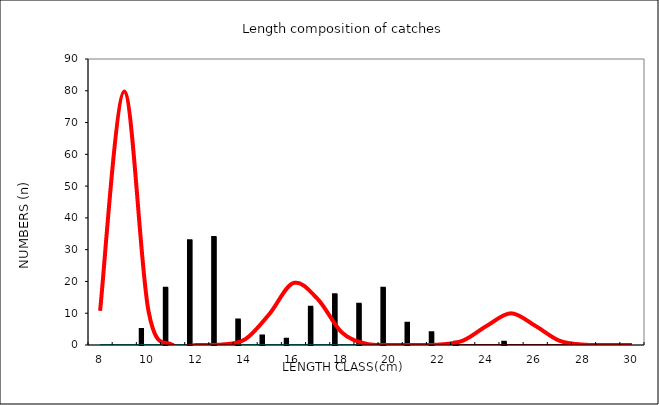
| Category | Series 0 | Series 1 | Series 2 | Series 3 |
|---|---|---|---|---|
| 8 | 0 | 10.798 | 0 | 0 |
| 9 | 0 | 79.788 | 0 | 0 |
| 10 | 5 | 10.798 | 0 | 0 |
| 11 | 18 | 0.027 | 0 | 0 |
| 12 | 33 | 0 | 0.003 | 0 |
| 13 | 34 | 0 | 0.121 | 0 |
| 14 | 8 | 0 | 1.787 | 0 |
| 15 | 3 | 0 | 9.718 | 0 |
| 16 | 2 | 0 | 19.515 | 0 |
| 17 | 12 | 0 | 14.474 | 0 |
| 18 | 16 | 0 | 3.965 | 0 |
| 19 | 13 | 0 | 0.401 | 0 |
| 20 | 18 | 0 | 0.015 | 0 |
| 21 | 7 | 0 | 0 | 0.003 |
| 22 | 4 | 0 | 0 | 0.111 |
| 23 | 1 | 0 | 0 | 1.35 |
| 24 | 0 | 0 | 0 | 6.049 |
| 25 | 1 | 0 | 0 | 9.974 |
| 26 | 0 | 0 | 0 | 6.049 |
| 27 | 0 | 0 | 0 | 1.35 |
| 28 | 0 | 0 | 0 | 0.111 |
| 29 | 0 | 0 | 0 | 0.003 |
| 30 | 0 | 0 | 0 | 0 |